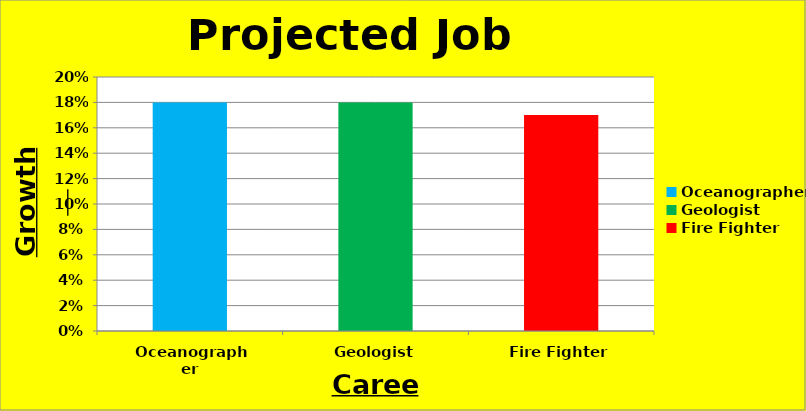
| Category | Percentage Growth |
|---|---|
| Oceanographer | 0.18 |
| Geologist | 0.18 |
| Fire Fighter | 0.17 |